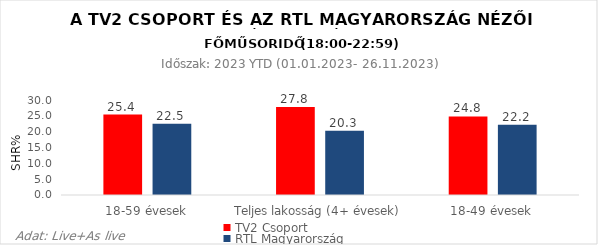
| Category | TV2 Csoport | RTL Magyarország |
|---|---|---|
| 18-59 évesek | 25.4 | 22.5 |
| Teljes lakosság (4+ évesek) | 27.8 | 20.3 |
| 18-49 évesek | 24.8 | 22.2 |